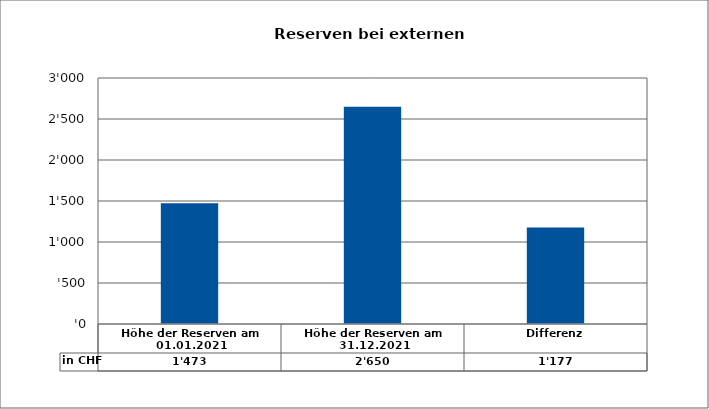
| Category | in CHF |
|---|---|
| Höhe der Reserven am 01.01.2021 | 1473.09 |
| Höhe der Reserven am 31.12.2021 | 2649.85 |
| Differenz | 1176.76 |